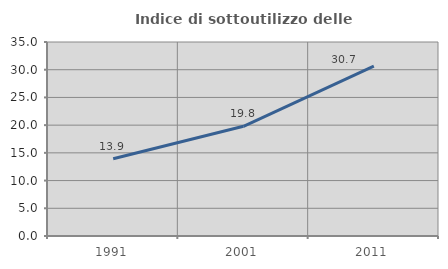
| Category | Indice di sottoutilizzo delle abitazioni  |
|---|---|
| 1991.0 | 13.926 |
| 2001.0 | 19.787 |
| 2011.0 | 30.659 |